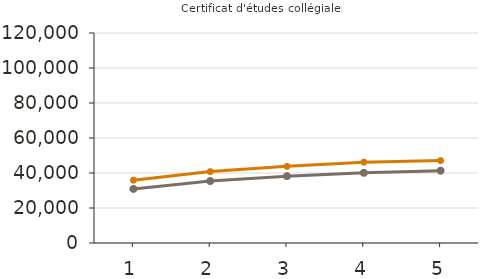
| Category | Moyens | Médians |
|---|---|---|
| 1.0 | 35900 | 30900 |
| 2.0 | 40800 | 35400 |
| 3.0 | 43800 | 38200 |
| 4.0 | 46200 | 40100 |
| 5.0 | 47100 | 41300 |